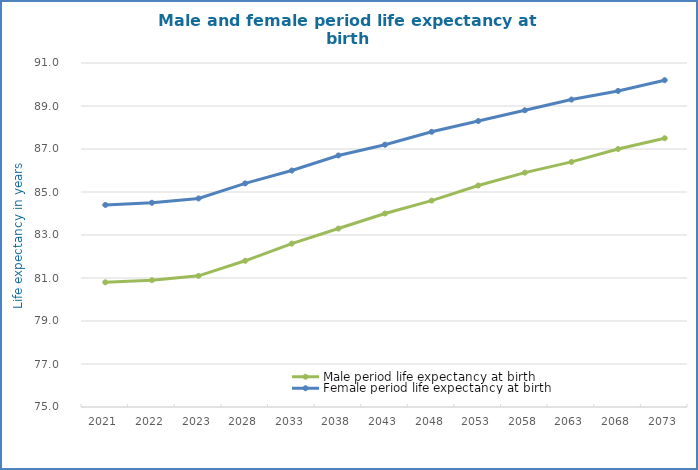
| Category | Male period life expectancy at birth | Female period life expectancy at birth |
|---|---|---|
| 2021 | 80.8 | 84.4 |
| 2022 | 80.9 | 84.5 |
| 2023 | 81.1 | 84.7 |
| 2028 | 81.8 | 85.4 |
| 2033 | 82.6 | 86 |
| 2038 | 83.3 | 86.7 |
| 2043 | 84 | 87.2 |
| 2048 | 84.6 | 87.8 |
| 2053 | 85.3 | 88.3 |
| 2058 | 85.9 | 88.8 |
| 2063 | 86.4 | 89.3 |
| 2068 | 87 | 89.7 |
| 2073 | 87.5 | 90.2 |